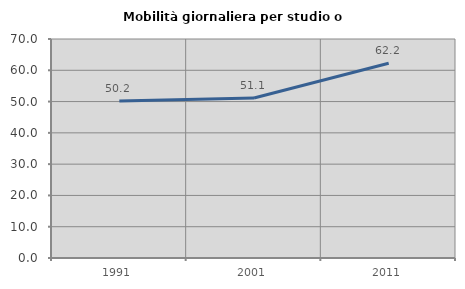
| Category | Mobilità giornaliera per studio o lavoro |
|---|---|
| 1991.0 | 50.185 |
| 2001.0 | 51.145 |
| 2011.0 | 62.241 |